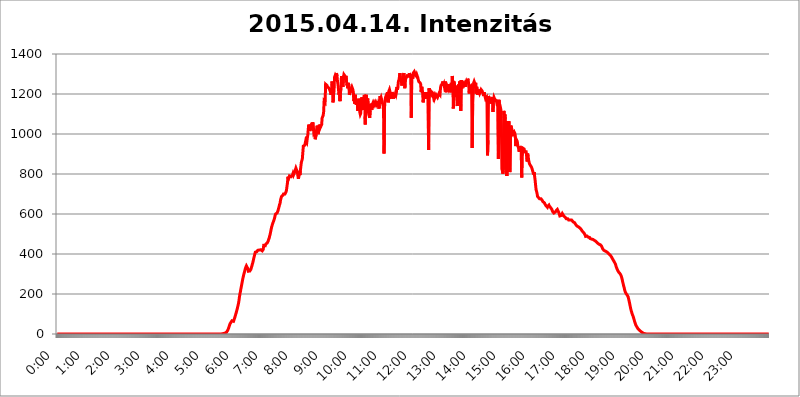
| Category | 2015.04.14. Intenzitás [W/m^2] |
|---|---|
| 0.0 | -0.256 |
| 0.0006944444444444445 | -0.256 |
| 0.001388888888888889 | -0.256 |
| 0.0020833333333333333 | -0.256 |
| 0.002777777777777778 | -0.256 |
| 0.003472222222222222 | -0.256 |
| 0.004166666666666667 | -0.256 |
| 0.004861111111111111 | -0.256 |
| 0.005555555555555556 | -0.256 |
| 0.0062499999999999995 | -0.256 |
| 0.006944444444444444 | -0.256 |
| 0.007638888888888889 | -0.256 |
| 0.008333333333333333 | -0.256 |
| 0.009027777777777779 | -0.256 |
| 0.009722222222222222 | -0.256 |
| 0.010416666666666666 | -0.256 |
| 0.011111111111111112 | -0.256 |
| 0.011805555555555555 | -0.256 |
| 0.012499999999999999 | -0.256 |
| 0.013194444444444444 | -0.256 |
| 0.013888888888888888 | -0.256 |
| 0.014583333333333332 | -0.256 |
| 0.015277777777777777 | -0.256 |
| 0.015972222222222224 | -0.256 |
| 0.016666666666666666 | -0.256 |
| 0.017361111111111112 | -0.256 |
| 0.018055555555555557 | -0.256 |
| 0.01875 | -0.256 |
| 0.019444444444444445 | -0.256 |
| 0.02013888888888889 | -0.256 |
| 0.020833333333333332 | -0.256 |
| 0.02152777777777778 | -0.256 |
| 0.022222222222222223 | -0.256 |
| 0.02291666666666667 | -0.256 |
| 0.02361111111111111 | -0.256 |
| 0.024305555555555556 | -0.256 |
| 0.024999999999999998 | -0.256 |
| 0.025694444444444447 | -0.256 |
| 0.02638888888888889 | -0.256 |
| 0.027083333333333334 | -0.256 |
| 0.027777777777777776 | -0.256 |
| 0.02847222222222222 | -0.256 |
| 0.029166666666666664 | -0.256 |
| 0.029861111111111113 | -0.256 |
| 0.030555555555555555 | -0.256 |
| 0.03125 | -0.256 |
| 0.03194444444444445 | -0.256 |
| 0.03263888888888889 | -0.256 |
| 0.03333333333333333 | -0.256 |
| 0.034027777777777775 | -0.256 |
| 0.034722222222222224 | -0.256 |
| 0.035416666666666666 | -0.256 |
| 0.036111111111111115 | -0.256 |
| 0.03680555555555556 | -0.256 |
| 0.0375 | -0.256 |
| 0.03819444444444444 | -0.256 |
| 0.03888888888888889 | -0.256 |
| 0.03958333333333333 | -0.256 |
| 0.04027777777777778 | -0.256 |
| 0.04097222222222222 | -0.256 |
| 0.041666666666666664 | -0.256 |
| 0.042361111111111106 | -0.256 |
| 0.04305555555555556 | -0.256 |
| 0.043750000000000004 | -0.256 |
| 0.044444444444444446 | -0.256 |
| 0.04513888888888889 | -0.256 |
| 0.04583333333333334 | -0.256 |
| 0.04652777777777778 | -0.256 |
| 0.04722222222222222 | -0.256 |
| 0.04791666666666666 | -0.256 |
| 0.04861111111111111 | -0.256 |
| 0.049305555555555554 | -0.256 |
| 0.049999999999999996 | -0.256 |
| 0.05069444444444445 | -0.256 |
| 0.051388888888888894 | -0.256 |
| 0.052083333333333336 | -0.256 |
| 0.05277777777777778 | -0.256 |
| 0.05347222222222222 | -0.256 |
| 0.05416666666666667 | -0.256 |
| 0.05486111111111111 | -0.256 |
| 0.05555555555555555 | -0.256 |
| 0.05625 | -0.256 |
| 0.05694444444444444 | -0.256 |
| 0.057638888888888885 | -0.256 |
| 0.05833333333333333 | -0.256 |
| 0.05902777777777778 | -0.256 |
| 0.059722222222222225 | -0.256 |
| 0.06041666666666667 | -0.256 |
| 0.061111111111111116 | -0.256 |
| 0.06180555555555556 | -0.256 |
| 0.0625 | -0.256 |
| 0.06319444444444444 | -0.256 |
| 0.06388888888888888 | -0.256 |
| 0.06458333333333334 | -0.256 |
| 0.06527777777777778 | -0.256 |
| 0.06597222222222222 | -0.256 |
| 0.06666666666666667 | -0.256 |
| 0.06736111111111111 | -0.256 |
| 0.06805555555555555 | -0.256 |
| 0.06874999999999999 | -0.256 |
| 0.06944444444444443 | -0.256 |
| 0.07013888888888889 | -0.256 |
| 0.07083333333333333 | -0.256 |
| 0.07152777777777779 | -0.256 |
| 0.07222222222222223 | -0.256 |
| 0.07291666666666667 | -0.256 |
| 0.07361111111111111 | -0.256 |
| 0.07430555555555556 | -0.256 |
| 0.075 | -0.256 |
| 0.07569444444444444 | -0.256 |
| 0.0763888888888889 | -0.256 |
| 0.07708333333333334 | -0.256 |
| 0.07777777777777778 | -0.256 |
| 0.07847222222222222 | -0.256 |
| 0.07916666666666666 | -0.256 |
| 0.0798611111111111 | -0.256 |
| 0.08055555555555556 | -0.256 |
| 0.08125 | -0.256 |
| 0.08194444444444444 | -0.256 |
| 0.08263888888888889 | -0.256 |
| 0.08333333333333333 | -0.256 |
| 0.08402777777777777 | -0.256 |
| 0.08472222222222221 | -0.256 |
| 0.08541666666666665 | -0.256 |
| 0.08611111111111112 | -0.256 |
| 0.08680555555555557 | -0.256 |
| 0.08750000000000001 | -0.256 |
| 0.08819444444444445 | -0.256 |
| 0.08888888888888889 | -0.256 |
| 0.08958333333333333 | -0.256 |
| 0.09027777777777778 | -0.256 |
| 0.09097222222222222 | -0.256 |
| 0.09166666666666667 | -0.256 |
| 0.09236111111111112 | -0.256 |
| 0.09305555555555556 | -0.256 |
| 0.09375 | -0.256 |
| 0.09444444444444444 | -0.256 |
| 0.09513888888888888 | -0.256 |
| 0.09583333333333333 | -0.256 |
| 0.09652777777777777 | -0.256 |
| 0.09722222222222222 | -0.256 |
| 0.09791666666666667 | -0.256 |
| 0.09861111111111111 | -0.256 |
| 0.09930555555555555 | -0.256 |
| 0.09999999999999999 | -0.256 |
| 0.10069444444444443 | -0.256 |
| 0.1013888888888889 | -0.256 |
| 0.10208333333333335 | -0.256 |
| 0.10277777777777779 | -0.256 |
| 0.10347222222222223 | -0.256 |
| 0.10416666666666667 | -0.256 |
| 0.10486111111111111 | -0.256 |
| 0.10555555555555556 | -0.256 |
| 0.10625 | -0.256 |
| 0.10694444444444444 | -0.256 |
| 0.1076388888888889 | -0.256 |
| 0.10833333333333334 | -0.256 |
| 0.10902777777777778 | -0.256 |
| 0.10972222222222222 | -0.256 |
| 0.1111111111111111 | -0.256 |
| 0.11180555555555556 | -0.256 |
| 0.11180555555555556 | -0.256 |
| 0.1125 | -0.256 |
| 0.11319444444444444 | -0.256 |
| 0.11388888888888889 | -0.256 |
| 0.11458333333333333 | -0.256 |
| 0.11527777777777777 | -0.256 |
| 0.11597222222222221 | -0.256 |
| 0.11666666666666665 | -0.256 |
| 0.1173611111111111 | -0.256 |
| 0.11805555555555557 | -0.256 |
| 0.11944444444444445 | -0.256 |
| 0.12013888888888889 | -0.256 |
| 0.12083333333333333 | -0.256 |
| 0.12152777777777778 | -0.256 |
| 0.12222222222222223 | -0.256 |
| 0.12291666666666667 | -0.256 |
| 0.12291666666666667 | -0.256 |
| 0.12361111111111112 | -0.256 |
| 0.12430555555555556 | -0.256 |
| 0.125 | -0.256 |
| 0.12569444444444444 | -0.256 |
| 0.12638888888888888 | -0.256 |
| 0.12708333333333333 | -0.256 |
| 0.16875 | -0.256 |
| 0.12847222222222224 | -0.256 |
| 0.12916666666666668 | -0.256 |
| 0.12986111111111112 | -0.256 |
| 0.13055555555555556 | -0.256 |
| 0.13125 | -0.256 |
| 0.13194444444444445 | -0.256 |
| 0.1326388888888889 | -0.256 |
| 0.13333333333333333 | -0.256 |
| 0.13402777777777777 | -0.256 |
| 0.13402777777777777 | -0.256 |
| 0.13472222222222222 | -0.256 |
| 0.13541666666666666 | -0.256 |
| 0.1361111111111111 | -0.256 |
| 0.13749999999999998 | -0.256 |
| 0.13819444444444443 | -0.256 |
| 0.1388888888888889 | -0.256 |
| 0.13958333333333334 | -0.256 |
| 0.14027777777777778 | -0.256 |
| 0.14097222222222222 | -0.256 |
| 0.14166666666666666 | -0.256 |
| 0.1423611111111111 | -0.256 |
| 0.14305555555555557 | -0.256 |
| 0.14375000000000002 | -0.256 |
| 0.14444444444444446 | -0.256 |
| 0.1451388888888889 | -0.256 |
| 0.1451388888888889 | -0.256 |
| 0.14652777777777778 | -0.256 |
| 0.14722222222222223 | -0.256 |
| 0.14791666666666667 | -0.256 |
| 0.1486111111111111 | -0.256 |
| 0.14930555555555555 | -0.256 |
| 0.15 | -0.256 |
| 0.15069444444444444 | -0.256 |
| 0.15138888888888888 | -0.256 |
| 0.15208333333333332 | -0.256 |
| 0.15277777777777776 | -0.256 |
| 0.15347222222222223 | -0.256 |
| 0.15416666666666667 | -0.256 |
| 0.15486111111111112 | -0.256 |
| 0.15555555555555556 | -0.256 |
| 0.15625 | -0.256 |
| 0.15694444444444444 | -0.256 |
| 0.15763888888888888 | -0.256 |
| 0.15833333333333333 | -0.256 |
| 0.15902777777777777 | -0.256 |
| 0.15972222222222224 | -0.256 |
| 0.16041666666666668 | -0.256 |
| 0.16111111111111112 | -0.256 |
| 0.16180555555555556 | -0.256 |
| 0.1625 | -0.256 |
| 0.16319444444444445 | -0.256 |
| 0.1638888888888889 | -0.256 |
| 0.16458333333333333 | -0.256 |
| 0.16527777777777777 | -0.256 |
| 0.16597222222222222 | -0.256 |
| 0.16666666666666666 | -0.256 |
| 0.1673611111111111 | -0.256 |
| 0.16805555555555554 | -0.256 |
| 0.16874999999999998 | -0.256 |
| 0.16944444444444443 | -0.256 |
| 0.17013888888888887 | -0.256 |
| 0.1708333333333333 | -0.256 |
| 0.17152777777777775 | -0.256 |
| 0.17222222222222225 | -0.256 |
| 0.1729166666666667 | -0.256 |
| 0.17361111111111113 | -0.256 |
| 0.17430555555555557 | -0.256 |
| 0.17500000000000002 | -0.256 |
| 0.17569444444444446 | -0.256 |
| 0.1763888888888889 | -0.256 |
| 0.17708333333333334 | -0.256 |
| 0.17777777777777778 | -0.256 |
| 0.17847222222222223 | -0.256 |
| 0.17916666666666667 | -0.256 |
| 0.1798611111111111 | -0.256 |
| 0.18055555555555555 | -0.256 |
| 0.18125 | -0.256 |
| 0.18194444444444444 | -0.256 |
| 0.1826388888888889 | -0.256 |
| 0.18333333333333335 | -0.256 |
| 0.1840277777777778 | -0.256 |
| 0.18472222222222223 | -0.256 |
| 0.18541666666666667 | -0.256 |
| 0.18611111111111112 | -0.256 |
| 0.18680555555555556 | -0.256 |
| 0.1875 | -0.256 |
| 0.18819444444444444 | -0.256 |
| 0.18888888888888888 | -0.256 |
| 0.18958333333333333 | -0.256 |
| 0.19027777777777777 | -0.256 |
| 0.1909722222222222 | -0.256 |
| 0.19166666666666665 | -0.256 |
| 0.19236111111111112 | -0.256 |
| 0.19305555555555554 | -0.256 |
| 0.19375 | -0.256 |
| 0.19444444444444445 | -0.256 |
| 0.1951388888888889 | -0.256 |
| 0.19583333333333333 | -0.256 |
| 0.19652777777777777 | -0.256 |
| 0.19722222222222222 | -0.256 |
| 0.19791666666666666 | -0.256 |
| 0.1986111111111111 | -0.256 |
| 0.19930555555555554 | -0.256 |
| 0.19999999999999998 | -0.256 |
| 0.20069444444444443 | -0.256 |
| 0.20138888888888887 | -0.256 |
| 0.2020833333333333 | -0.256 |
| 0.2027777777777778 | -0.256 |
| 0.2034722222222222 | -0.256 |
| 0.2041666666666667 | -0.256 |
| 0.20486111111111113 | -0.256 |
| 0.20555555555555557 | -0.256 |
| 0.20625000000000002 | -0.256 |
| 0.20694444444444446 | -0.256 |
| 0.2076388888888889 | -0.256 |
| 0.20833333333333334 | -0.256 |
| 0.20902777777777778 | -0.256 |
| 0.20972222222222223 | -0.256 |
| 0.21041666666666667 | -0.256 |
| 0.2111111111111111 | -0.256 |
| 0.21180555555555555 | -0.256 |
| 0.2125 | -0.256 |
| 0.21319444444444444 | -0.256 |
| 0.2138888888888889 | -0.256 |
| 0.21458333333333335 | -0.256 |
| 0.2152777777777778 | -0.256 |
| 0.21597222222222223 | -0.256 |
| 0.21666666666666667 | -0.256 |
| 0.21736111111111112 | -0.256 |
| 0.21805555555555556 | -0.256 |
| 0.21875 | -0.256 |
| 0.21944444444444444 | -0.256 |
| 0.22013888888888888 | -0.256 |
| 0.22083333333333333 | -0.256 |
| 0.22152777777777777 | -0.256 |
| 0.2222222222222222 | -0.256 |
| 0.22291666666666665 | -0.256 |
| 0.2236111111111111 | -0.256 |
| 0.22430555555555556 | -0.256 |
| 0.225 | -0.256 |
| 0.22569444444444445 | -0.256 |
| 0.2263888888888889 | -0.256 |
| 0.22708333333333333 | -0.256 |
| 0.22777777777777777 | -0.256 |
| 0.22847222222222222 | -0.256 |
| 0.22916666666666666 | -0.256 |
| 0.2298611111111111 | -0.256 |
| 0.23055555555555554 | 1.09 |
| 0.23124999999999998 | 1.09 |
| 0.23194444444444443 | 1.09 |
| 0.23263888888888887 | 1.09 |
| 0.2333333333333333 | 2.439 |
| 0.2340277777777778 | 3.791 |
| 0.2347222222222222 | 3.791 |
| 0.2354166666666667 | 5.146 |
| 0.23611111111111113 | 6.503 |
| 0.23680555555555557 | 7.862 |
| 0.23750000000000002 | 9.225 |
| 0.23819444444444446 | 13.325 |
| 0.2388888888888889 | 17.444 |
| 0.23958333333333334 | 22.965 |
| 0.24027777777777778 | 28.514 |
| 0.24097222222222223 | 36.881 |
| 0.24166666666666667 | 43.886 |
| 0.2423611111111111 | 50.914 |
| 0.24305555555555555 | 55.139 |
| 0.24375 | 59.368 |
| 0.24444444444444446 | 63.6 |
| 0.24513888888888888 | 66.423 |
| 0.24583333333333335 | 65.012 |
| 0.2465277777777778 | 62.189 |
| 0.24722222222222223 | 63.6 |
| 0.24791666666666667 | 70.658 |
| 0.24861111111111112 | 77.715 |
| 0.24930555555555556 | 86.175 |
| 0.25 | 94.617 |
| 0.25069444444444444 | 103.035 |
| 0.2513888888888889 | 111.42 |
| 0.2520833333333333 | 121.152 |
| 0.25277777777777777 | 130.821 |
| 0.2534722222222222 | 141.782 |
| 0.25416666666666665 | 152.637 |
| 0.2548611111111111 | 167.374 |
| 0.2555555555555556 | 185.79 |
| 0.25625000000000003 | 201.258 |
| 0.2569444444444445 | 212.664 |
| 0.2576388888888889 | 227.618 |
| 0.25833333333333336 | 239.868 |
| 0.2590277777777778 | 253.137 |
| 0.25972222222222224 | 266.216 |
| 0.2604166666666667 | 279.136 |
| 0.2611111111111111 | 289.616 |
| 0.26180555555555557 | 300.041 |
| 0.2625 | 309.284 |
| 0.26319444444444445 | 318.527 |
| 0.2638888888888889 | 327.793 |
| 0.26458333333333334 | 334.774 |
| 0.2652777777777778 | 340.62 |
| 0.2659722222222222 | 342.968 |
| 0.26666666666666666 | 339.449 |
| 0.2673611111111111 | 326.633 |
| 0.26805555555555555 | 313.904 |
| 0.26875 | 310.439 |
| 0.26944444444444443 | 312.749 |
| 0.2701388888888889 | 315.059 |
| 0.2708333333333333 | 318.527 |
| 0.27152777777777776 | 323.156 |
| 0.2722222222222222 | 331.279 |
| 0.27291666666666664 | 339.449 |
| 0.2736111111111111 | 348.865 |
| 0.2743055555555555 | 357.196 |
| 0.27499999999999997 | 368.07 |
| 0.27569444444444446 | 379.171 |
| 0.27638888888888885 | 389.27 |
| 0.27708333333333335 | 399.628 |
| 0.2777777777777778 | 408.934 |
| 0.27847222222222223 | 407.589 |
| 0.2791666666666667 | 407.589 |
| 0.2798611111111111 | 411.638 |
| 0.28055555555555556 | 414.364 |
| 0.28125 | 418.495 |
| 0.28194444444444444 | 418.495 |
| 0.2826388888888889 | 418.495 |
| 0.2833333333333333 | 419.883 |
| 0.28402777777777777 | 422.678 |
| 0.2847222222222222 | 422.678 |
| 0.28541666666666665 | 421.278 |
| 0.28611111111111115 | 419.883 |
| 0.28680555555555554 | 417.112 |
| 0.28750000000000003 | 415.735 |
| 0.2881944444444445 | 417.112 |
| 0.2888888888888889 | 422.678 |
| 0.28958333333333336 | 442.962 |
| 0.2902777777777778 | 445.971 |
| 0.29097222222222224 | 447.487 |
| 0.2916666666666667 | 441.469 |
| 0.2923611111111111 | 449.011 |
| 0.29305555555555557 | 449.011 |
| 0.29375 | 452.082 |
| 0.29444444444444445 | 455.184 |
| 0.2951388888888889 | 459.898 |
| 0.29583333333333334 | 464.688 |
| 0.2965277777777778 | 472.848 |
| 0.2972222222222222 | 479.541 |
| 0.29791666666666666 | 489.873 |
| 0.2986111111111111 | 498.764 |
| 0.29930555555555555 | 511.671 |
| 0.3 | 523.186 |
| 0.30069444444444443 | 535.145 |
| 0.3013888888888889 | 543.376 |
| 0.3020833333333333 | 551.823 |
| 0.30277777777777776 | 558.305 |
| 0.3034722222222222 | 564.917 |
| 0.30416666666666664 | 571.661 |
| 0.3048611111111111 | 580.866 |
| 0.3055555555555555 | 592.725 |
| 0.30624999999999997 | 600.035 |
| 0.3069444444444444 | 600.035 |
| 0.3076388888888889 | 600.035 |
| 0.30833333333333335 | 604.992 |
| 0.3090277777777778 | 607.495 |
| 0.30972222222222223 | 617.682 |
| 0.3104166666666667 | 628.152 |
| 0.3111111111111111 | 636.194 |
| 0.31180555555555556 | 647.179 |
| 0.3125 | 652.786 |
| 0.31319444444444444 | 670.078 |
| 0.3138888888888889 | 673.03 |
| 0.3145833333333333 | 688.102 |
| 0.31527777777777777 | 691.18 |
| 0.3159722222222222 | 691.18 |
| 0.31666666666666665 | 694.278 |
| 0.31736111111111115 | 700.54 |
| 0.31805555555555554 | 700.54 |
| 0.31875000000000003 | 700.54 |
| 0.3194444444444445 | 700.54 |
| 0.3201388888888889 | 700.54 |
| 0.32083333333333336 | 710.098 |
| 0.3215277777777778 | 719.855 |
| 0.32222222222222224 | 723.153 |
| 0.3229166666666667 | 757.414 |
| 0.3236111111111111 | 786.575 |
| 0.32430555555555557 | 775.451 |
| 0.325 | 782.842 |
| 0.32569444444444445 | 790.334 |
| 0.3263888888888889 | 790.334 |
| 0.32708333333333334 | 786.575 |
| 0.3277777777777778 | 786.575 |
| 0.3284722222222222 | 786.575 |
| 0.32916666666666666 | 782.842 |
| 0.3298611111111111 | 794.119 |
| 0.33055555555555555 | 801.768 |
| 0.33125 | 794.119 |
| 0.33194444444444443 | 794.119 |
| 0.3326388888888889 | 805.632 |
| 0.3333333333333333 | 813.439 |
| 0.3340277777777778 | 817.382 |
| 0.3347222222222222 | 829.377 |
| 0.3354166666666667 | 825.351 |
| 0.3361111111111111 | 825.351 |
| 0.3368055555555556 | 809.522 |
| 0.33749999999999997 | 790.334 |
| 0.33819444444444446 | 775.451 |
| 0.33888888888888885 | 790.334 |
| 0.33958333333333335 | 813.439 |
| 0.34027777777777773 | 794.119 |
| 0.34097222222222223 | 817.382 |
| 0.3416666666666666 | 821.353 |
| 0.3423611111111111 | 858.335 |
| 0.3430555555555555 | 866.865 |
| 0.34375 | 875.511 |
| 0.3444444444444445 | 875.511 |
| 0.3451388888888889 | 939.404 |
| 0.3458333333333334 | 934.639 |
| 0.34652777777777777 | 939.404 |
| 0.34722222222222227 | 944.201 |
| 0.34791666666666665 | 944.201 |
| 0.34861111111111115 | 968.671 |
| 0.34930555555555554 | 973.663 |
| 0.35000000000000003 | 958.785 |
| 0.3506944444444444 | 978.688 |
| 0.3513888888888889 | 993.965 |
| 0.3520833333333333 | 1025.437 |
| 0.3527777777777778 | 1047.117 |
| 0.3534722222222222 | 1036.206 |
| 0.3541666666666667 | 1014.809 |
| 0.3548611111111111 | 1025.437 |
| 0.35555555555555557 | 1036.206 |
| 0.35625 | 1030.804 |
| 0.35694444444444445 | 1036.206 |
| 0.3576388888888889 | 1030.804 |
| 0.35833333333333334 | 1058.17 |
| 0.3590277777777778 | 1036.206 |
| 0.3597222222222222 | 1009.546 |
| 0.36041666666666666 | 1014.809 |
| 0.3611111111111111 | 1004.318 |
| 0.36180555555555555 | 973.663 |
| 0.3625 | 968.671 |
| 0.36319444444444443 | 999.125 |
| 0.3638888888888889 | 1025.437 |
| 0.3645833333333333 | 1041.644 |
| 0.3652777777777778 | 1014.809 |
| 0.3659722222222222 | 999.125 |
| 0.3666666666666667 | 1014.809 |
| 0.3673611111111111 | 1047.117 |
| 0.3680555555555556 | 1047.117 |
| 0.36874999999999997 | 1030.804 |
| 0.36944444444444446 | 1036.206 |
| 0.37013888888888885 | 1041.644 |
| 0.37083333333333335 | 1047.117 |
| 0.37152777777777773 | 1080.711 |
| 0.37222222222222223 | 1086.439 |
| 0.3729166666666666 | 1092.203 |
| 0.3736111111111111 | 1109.72 |
| 0.3743055555555555 | 1164.337 |
| 0.375 | 1164.337 |
| 0.3756944444444445 | 1158.113 |
| 0.3763888888888889 | 1248.934 |
| 0.3770833333333334 | 1248.934 |
| 0.37777777777777777 | 1248.934 |
| 0.37847222222222227 | 1242.179 |
| 0.37916666666666665 | 1235.465 |
| 0.37986111111111115 | 1235.465 |
| 0.38055555555555554 | 1235.465 |
| 0.38125000000000003 | 1228.794 |
| 0.3819444444444444 | 1222.164 |
| 0.3826388888888889 | 1222.164 |
| 0.3833333333333333 | 1209.029 |
| 0.3840277777777778 | 1196.058 |
| 0.3847222222222222 | 1222.164 |
| 0.3854166666666667 | 1262.571 |
| 0.3861111111111111 | 1235.465 |
| 0.38680555555555557 | 1158.113 |
| 0.3875 | 1196.058 |
| 0.38819444444444445 | 1215.576 |
| 0.3888888888888889 | 1283.348 |
| 0.38958333333333334 | 1290.36 |
| 0.3902777777777778 | 1283.348 |
| 0.3909722222222222 | 1297.416 |
| 0.39166666666666666 | 1304.515 |
| 0.3923611111111111 | 1290.36 |
| 0.39305555555555555 | 1262.571 |
| 0.39375 | 1248.934 |
| 0.39444444444444443 | 1248.934 |
| 0.3951388888888889 | 1196.058 |
| 0.3958333333333333 | 1209.029 |
| 0.3965277777777778 | 1164.337 |
| 0.3972222222222222 | 1209.029 |
| 0.3979166666666667 | 1222.164 |
| 0.3986111111111111 | 1290.36 |
| 0.3993055555555556 | 1262.571 |
| 0.39999999999999997 | 1248.934 |
| 0.40069444444444446 | 1235.465 |
| 0.40138888888888885 | 1283.348 |
| 0.40208333333333335 | 1297.416 |
| 0.40277777777777773 | 1297.416 |
| 0.40347222222222223 | 1290.36 |
| 0.4041666666666666 | 1269.454 |
| 0.4048611111111111 | 1290.36 |
| 0.4055555555555555 | 1269.454 |
| 0.40625 | 1242.179 |
| 0.4069444444444445 | 1248.934 |
| 0.4076388888888889 | 1228.794 |
| 0.4083333333333334 | 1255.731 |
| 0.40902777777777777 | 1242.179 |
| 0.40972222222222227 | 1196.058 |
| 0.41041666666666665 | 1202.523 |
| 0.41111111111111115 | 1202.523 |
| 0.41180555555555554 | 1202.523 |
| 0.41250000000000003 | 1228.794 |
| 0.4131944444444444 | 1235.465 |
| 0.4138888888888889 | 1235.465 |
| 0.4145833333333333 | 1222.164 |
| 0.4152777777777778 | 1209.029 |
| 0.4159722222222222 | 1164.337 |
| 0.4166666666666667 | 1183.249 |
| 0.4173611111111111 | 1151.928 |
| 0.41805555555555557 | 1196.058 |
| 0.41875 | 1164.337 |
| 0.41944444444444445 | 1145.782 |
| 0.4201388888888889 | 1164.337 |
| 0.42083333333333334 | 1151.928 |
| 0.4215277777777778 | 1115.634 |
| 0.4222222222222222 | 1151.928 |
| 0.42291666666666666 | 1176.905 |
| 0.4236111111111111 | 1127.578 |
| 0.42430555555555555 | 1109.72 |
| 0.425 | 1098.004 |
| 0.42569444444444443 | 1103.843 |
| 0.4263888888888889 | 1151.928 |
| 0.4270833333333333 | 1183.249 |
| 0.4277777777777778 | 1164.337 |
| 0.4284722222222222 | 1176.905 |
| 0.4291666666666667 | 1121.587 |
| 0.4298611111111111 | 1170.601 |
| 0.4305555555555556 | 1196.058 |
| 0.43124999999999997 | 1189.633 |
| 0.43194444444444446 | 1047.117 |
| 0.43263888888888885 | 1176.905 |
| 0.43333333333333335 | 1196.058 |
| 0.43402777777777773 | 1176.905 |
| 0.43472222222222223 | 1158.113 |
| 0.4354166666666666 | 1176.905 |
| 0.4361111111111111 | 1139.675 |
| 0.4368055555555555 | 1098.004 |
| 0.4375 | 1092.203 |
| 0.4381944444444445 | 1080.711 |
| 0.4388888888888889 | 1115.634 |
| 0.4395833333333334 | 1151.928 |
| 0.44027777777777777 | 1145.782 |
| 0.44097222222222227 | 1121.587 |
| 0.44166666666666665 | 1127.578 |
| 0.44236111111111115 | 1151.928 |
| 0.44305555555555554 | 1158.113 |
| 0.44375000000000003 | 1158.113 |
| 0.4444444444444444 | 1145.782 |
| 0.4451388888888889 | 1151.928 |
| 0.4458333333333333 | 1139.675 |
| 0.4465277777777778 | 1151.928 |
| 0.4472222222222222 | 1145.782 |
| 0.4479166666666667 | 1151.928 |
| 0.4486111111111111 | 1139.675 |
| 0.44930555555555557 | 1164.337 |
| 0.45 | 1139.675 |
| 0.45069444444444445 | 1145.782 |
| 0.4513888888888889 | 1127.578 |
| 0.45208333333333334 | 1170.601 |
| 0.4527777777777778 | 1189.633 |
| 0.4534722222222222 | 1176.905 |
| 0.45416666666666666 | 1183.249 |
| 0.4548611111111111 | 1183.249 |
| 0.45555555555555555 | 1164.337 |
| 0.45625 | 1151.928 |
| 0.45694444444444443 | 1145.782 |
| 0.4576388888888889 | 1115.634 |
| 0.4583333333333333 | 902.16 |
| 0.4590277777777778 | 1133.607 |
| 0.4597222222222222 | 1164.337 |
| 0.4604166666666667 | 1183.249 |
| 0.4611111111111111 | 1189.633 |
| 0.4618055555555556 | 1183.249 |
| 0.46249999999999997 | 1196.058 |
| 0.46319444444444446 | 1209.029 |
| 0.46388888888888885 | 1183.249 |
| 0.46458333333333335 | 1158.113 |
| 0.46527777777777773 | 1215.576 |
| 0.46597222222222223 | 1222.164 |
| 0.4666666666666666 | 1222.164 |
| 0.4673611111111111 | 1202.523 |
| 0.4680555555555555 | 1183.249 |
| 0.46875 | 1176.905 |
| 0.4694444444444445 | 1209.029 |
| 0.4701388888888889 | 1202.523 |
| 0.4708333333333334 | 1196.058 |
| 0.47152777777777777 | 1176.905 |
| 0.47222222222222227 | 1196.058 |
| 0.47291666666666665 | 1183.249 |
| 0.47361111111111115 | 1183.249 |
| 0.47430555555555554 | 1202.523 |
| 0.47500000000000003 | 1196.058 |
| 0.4756944444444444 | 1209.029 |
| 0.4763888888888889 | 1235.465 |
| 0.4770833333333333 | 1222.164 |
| 0.4777777777777778 | 1235.465 |
| 0.4784722222222222 | 1262.571 |
| 0.4791666666666667 | 1269.454 |
| 0.4798611111111111 | 1283.348 |
| 0.48055555555555557 | 1304.515 |
| 0.48125 | 1276.38 |
| 0.48194444444444445 | 1276.38 |
| 0.4826388888888889 | 1269.454 |
| 0.48333333333333334 | 1242.179 |
| 0.4840277777777778 | 1276.38 |
| 0.4847222222222222 | 1262.571 |
| 0.48541666666666666 | 1297.416 |
| 0.4861111111111111 | 1304.515 |
| 0.48680555555555555 | 1283.348 |
| 0.4875 | 1228.794 |
| 0.48819444444444443 | 1283.348 |
| 0.4888888888888889 | 1276.38 |
| 0.4895833333333333 | 1283.348 |
| 0.4902777777777778 | 1283.348 |
| 0.4909722222222222 | 1290.36 |
| 0.4916666666666667 | 1297.416 |
| 0.4923611111111111 | 1283.348 |
| 0.4930555555555556 | 1290.36 |
| 0.49374999999999997 | 1304.515 |
| 0.49444444444444446 | 1297.416 |
| 0.49513888888888885 | 1297.416 |
| 0.49583333333333335 | 1290.36 |
| 0.49652777777777773 | 1080.711 |
| 0.49722222222222223 | 1297.416 |
| 0.4979166666666666 | 1290.36 |
| 0.4986111111111111 | 1276.38 |
| 0.4993055555555555 | 1304.515 |
| 0.5 | 1304.515 |
| 0.5006944444444444 | 1311.658 |
| 0.5013888888888889 | 1311.658 |
| 0.5020833333333333 | 1297.416 |
| 0.5027777777777778 | 1297.416 |
| 0.5034722222222222 | 1290.36 |
| 0.5041666666666667 | 1297.416 |
| 0.5048611111111111 | 1290.36 |
| 0.5055555555555555 | 1283.348 |
| 0.50625 | 1283.348 |
| 0.5069444444444444 | 1262.571 |
| 0.5076388888888889 | 1262.571 |
| 0.5083333333333333 | 1262.571 |
| 0.5090277777777777 | 1255.731 |
| 0.5097222222222222 | 1248.934 |
| 0.5104166666666666 | 1209.029 |
| 0.5111111111111112 | 1235.465 |
| 0.5118055555555555 | 1228.794 |
| 0.5125000000000001 | 1202.523 |
| 0.5131944444444444 | 1158.113 |
| 0.513888888888889 | 1183.249 |
| 0.5145833333333333 | 1176.905 |
| 0.5152777777777778 | 1196.058 |
| 0.5159722222222222 | 1209.029 |
| 0.5166666666666667 | 1209.029 |
| 0.517361111111111 | 1176.905 |
| 0.5180555555555556 | 1189.633 |
| 0.5187499999999999 | 1209.029 |
| 0.5194444444444445 | 1189.633 |
| 0.5201388888888888 | 1209.029 |
| 0.5208333333333334 | 920.533 |
| 0.5215277777777778 | 1228.794 |
| 0.5222222222222223 | 1215.576 |
| 0.5229166666666667 | 1222.164 |
| 0.5236111111111111 | 1189.633 |
| 0.5243055555555556 | 1215.576 |
| 0.525 | 1196.058 |
| 0.5256944444444445 | 1196.058 |
| 0.5263888888888889 | 1202.523 |
| 0.5270833333333333 | 1196.058 |
| 0.5277777777777778 | 1183.249 |
| 0.5284722222222222 | 1189.633 |
| 0.5291666666666667 | 1176.905 |
| 0.5298611111111111 | 1176.905 |
| 0.5305555555555556 | 1176.905 |
| 0.53125 | 1196.058 |
| 0.5319444444444444 | 1196.058 |
| 0.5326388888888889 | 1196.058 |
| 0.5333333333333333 | 1183.249 |
| 0.5340277777777778 | 1183.249 |
| 0.5347222222222222 | 1196.058 |
| 0.5354166666666667 | 1202.523 |
| 0.5361111111111111 | 1202.523 |
| 0.5368055555555555 | 1196.058 |
| 0.5375 | 1228.794 |
| 0.5381944444444444 | 1242.179 |
| 0.5388888888888889 | 1242.179 |
| 0.5395833333333333 | 1248.934 |
| 0.5402777777777777 | 1248.934 |
| 0.5409722222222222 | 1262.571 |
| 0.5416666666666666 | 1242.179 |
| 0.5423611111111112 | 1248.934 |
| 0.5430555555555555 | 1235.465 |
| 0.5437500000000001 | 1242.179 |
| 0.5444444444444444 | 1262.571 |
| 0.545138888888889 | 1209.029 |
| 0.5458333333333333 | 1242.179 |
| 0.5465277777777778 | 1222.164 |
| 0.5472222222222222 | 1235.465 |
| 0.5479166666666667 | 1228.794 |
| 0.548611111111111 | 1242.179 |
| 0.5493055555555556 | 1248.934 |
| 0.5499999999999999 | 1248.934 |
| 0.5506944444444445 | 1209.029 |
| 0.5513888888888888 | 1242.179 |
| 0.5520833333333334 | 1248.934 |
| 0.5527777777777778 | 1255.731 |
| 0.5534722222222223 | 1209.029 |
| 0.5541666666666667 | 1290.36 |
| 0.5548611111111111 | 1248.934 |
| 0.5555555555555556 | 1127.578 |
| 0.55625 | 1262.571 |
| 0.5569444444444445 | 1262.571 |
| 0.5576388888888889 | 1235.465 |
| 0.5583333333333333 | 1242.179 |
| 0.5590277777777778 | 1222.164 |
| 0.5597222222222222 | 1202.523 |
| 0.5604166666666667 | 1202.523 |
| 0.5611111111111111 | 1139.675 |
| 0.5618055555555556 | 1215.576 |
| 0.5625 | 1235.465 |
| 0.5631944444444444 | 1248.934 |
| 0.5638888888888889 | 1235.465 |
| 0.5645833333333333 | 1262.571 |
| 0.5652777777777778 | 1222.164 |
| 0.5659722222222222 | 1115.634 |
| 0.5666666666666667 | 1269.454 |
| 0.5673611111111111 | 1228.794 |
| 0.5680555555555555 | 1235.465 |
| 0.56875 | 1248.934 |
| 0.5694444444444444 | 1248.934 |
| 0.5701388888888889 | 1255.731 |
| 0.5708333333333333 | 1248.934 |
| 0.5715277777777777 | 1255.731 |
| 0.5722222222222222 | 1235.465 |
| 0.5729166666666666 | 1255.731 |
| 0.5736111111111112 | 1262.571 |
| 0.5743055555555555 | 1255.731 |
| 0.5750000000000001 | 1262.571 |
| 0.5756944444444444 | 1276.38 |
| 0.576388888888889 | 1269.454 |
| 0.5770833333333333 | 1248.934 |
| 0.5777777777777778 | 1202.523 |
| 0.5784722222222222 | 1235.465 |
| 0.5791666666666667 | 1235.465 |
| 0.579861111111111 | 1235.465 |
| 0.5805555555555556 | 1242.179 |
| 0.5812499999999999 | 1209.029 |
| 0.5819444444444445 | 929.905 |
| 0.5826388888888888 | 1151.928 |
| 0.5833333333333334 | 1202.523 |
| 0.5840277777777778 | 1255.731 |
| 0.5847222222222223 | 1262.571 |
| 0.5854166666666667 | 1262.571 |
| 0.5861111111111111 | 1248.934 |
| 0.5868055555555556 | 1255.731 |
| 0.5875 | 1202.523 |
| 0.5881944444444445 | 1235.465 |
| 0.5888888888888889 | 1228.794 |
| 0.5895833333333333 | 1196.058 |
| 0.5902777777777778 | 1222.164 |
| 0.5909722222222222 | 1215.576 |
| 0.5916666666666667 | 1209.029 |
| 0.5923611111111111 | 1202.523 |
| 0.5930555555555556 | 1202.523 |
| 0.59375 | 1215.576 |
| 0.5944444444444444 | 1222.164 |
| 0.5951388888888889 | 1222.164 |
| 0.5958333333333333 | 1215.576 |
| 0.5965277777777778 | 1209.029 |
| 0.5972222222222222 | 1202.523 |
| 0.5979166666666667 | 1189.633 |
| 0.5986111111111111 | 1209.029 |
| 0.5993055555555555 | 1196.058 |
| 0.6 | 1196.058 |
| 0.6006944444444444 | 1176.905 |
| 0.6013888888888889 | 1176.905 |
| 0.6020833333333333 | 1183.249 |
| 0.6027777777777777 | 1151.928 |
| 0.6034722222222222 | 893.157 |
| 0.6041666666666666 | 968.671 |
| 0.6048611111111112 | 1189.633 |
| 0.6055555555555555 | 1183.249 |
| 0.6062500000000001 | 1183.249 |
| 0.6069444444444444 | 1164.337 |
| 0.607638888888889 | 1164.337 |
| 0.6083333333333333 | 1170.601 |
| 0.6090277777777778 | 1151.928 |
| 0.6097222222222222 | 1183.249 |
| 0.6104166666666667 | 1170.601 |
| 0.611111111111111 | 1109.72 |
| 0.6118055555555556 | 1170.601 |
| 0.6124999999999999 | 1183.249 |
| 0.6131944444444445 | 1176.905 |
| 0.6138888888888888 | 1176.905 |
| 0.6145833333333334 | 1170.601 |
| 0.6152777777777778 | 1170.601 |
| 0.6159722222222223 | 1164.337 |
| 0.6166666666666667 | 1164.337 |
| 0.6173611111111111 | 1139.675 |
| 0.6180555555555556 | 1170.601 |
| 0.61875 | 875.511 |
| 0.6194444444444445 | 1170.601 |
| 0.6201388888888889 | 1151.928 |
| 0.6208333333333333 | 1145.782 |
| 0.6215277777777778 | 1145.782 |
| 0.6222222222222222 | 1121.587 |
| 0.6229166666666667 | 1041.644 |
| 0.6236111111111111 | 825.351 |
| 0.6243055555555556 | 817.382 |
| 0.625 | 801.768 |
| 0.6256944444444444 | 817.382 |
| 0.6263888888888889 | 1115.634 |
| 0.6270833333333333 | 1080.711 |
| 0.6277777777777778 | 1098.004 |
| 0.6284722222222222 | 1075.021 |
| 0.6291666666666667 | 821.353 |
| 0.6298611111111111 | 1063.751 |
| 0.6305555555555555 | 790.334 |
| 0.63125 | 1063.751 |
| 0.6319444444444444 | 1063.751 |
| 0.6326388888888889 | 866.865 |
| 0.6333333333333333 | 1063.751 |
| 0.6340277777777777 | 1063.751 |
| 0.6347222222222222 | 809.522 |
| 0.6354166666666666 | 813.439 |
| 0.6361111111111112 | 1041.644 |
| 0.6368055555555555 | 1041.644 |
| 0.6375000000000001 | 1025.437 |
| 0.6381944444444444 | 1025.437 |
| 0.638888888888889 | 988.839 |
| 0.6395833333333333 | 1020.106 |
| 0.6402777777777778 | 1014.809 |
| 0.6409722222222222 | 1014.809 |
| 0.6416666666666667 | 1004.318 |
| 0.642361111111111 | 993.965 |
| 0.6430555555555556 | 939.404 |
| 0.6437499999999999 | 973.663 |
| 0.6444444444444445 | 968.671 |
| 0.6451388888888888 | 963.712 |
| 0.6458333333333334 | 944.201 |
| 0.6465277777777778 | 939.404 |
| 0.6472222222222223 | 925.203 |
| 0.6479166666666667 | 911.285 |
| 0.6486111111111111 | 939.404 |
| 0.6493055555555556 | 939.404 |
| 0.65 | 944.201 |
| 0.6506944444444445 | 920.533 |
| 0.6513888888888889 | 782.842 |
| 0.6520833333333333 | 906.707 |
| 0.6527777777777778 | 929.905 |
| 0.6534722222222222 | 929.905 |
| 0.6541666666666667 | 925.203 |
| 0.6548611111111111 | 925.203 |
| 0.6555555555555556 | 911.285 |
| 0.65625 | 906.707 |
| 0.6569444444444444 | 911.285 |
| 0.6576388888888889 | 911.285 |
| 0.6583333333333333 | 915.893 |
| 0.6590277777777778 | 862.585 |
| 0.6597222222222222 | 902.16 |
| 0.6604166666666667 | 888.701 |
| 0.6611111111111111 | 871.173 |
| 0.6618055555555555 | 858.335 |
| 0.6625 | 849.92 |
| 0.6631944444444444 | 849.92 |
| 0.6638888888888889 | 841.619 |
| 0.6645833333333333 | 837.51 |
| 0.6652777777777777 | 833.43 |
| 0.6659722222222222 | 825.351 |
| 0.6666666666666666 | 817.382 |
| 0.6673611111111111 | 817.382 |
| 0.6680555555555556 | 797.931 |
| 0.6687500000000001 | 809.522 |
| 0.6694444444444444 | 790.334 |
| 0.6701388888888888 | 771.794 |
| 0.6708333333333334 | 746.886 |
| 0.6715277777777778 | 723.153 |
| 0.6722222222222222 | 713.328 |
| 0.6729166666666666 | 703.704 |
| 0.6736111111111112 | 688.102 |
| 0.6743055555555556 | 685.046 |
| 0.6749999999999999 | 682.011 |
| 0.6756944444444444 | 678.997 |
| 0.6763888888888889 | 676.003 |
| 0.6770833333333334 | 676.003 |
| 0.6777777777777777 | 678.997 |
| 0.6784722222222223 | 676.003 |
| 0.6791666666666667 | 673.03 |
| 0.6798611111111111 | 670.078 |
| 0.6805555555555555 | 667.146 |
| 0.68125 | 661.343 |
| 0.6819444444444445 | 658.471 |
| 0.6826388888888889 | 658.471 |
| 0.6833333333333332 | 655.618 |
| 0.6840277777777778 | 649.973 |
| 0.6847222222222222 | 647.179 |
| 0.6854166666666667 | 641.649 |
| 0.686111111111111 | 641.649 |
| 0.6868055555555556 | 644.405 |
| 0.6875 | 633.495 |
| 0.6881944444444444 | 638.912 |
| 0.688888888888889 | 641.649 |
| 0.6895833333333333 | 644.405 |
| 0.6902777777777778 | 638.912 |
| 0.6909722222222222 | 636.194 |
| 0.6916666666666668 | 633.495 |
| 0.6923611111111111 | 630.814 |
| 0.6930555555555555 | 633.495 |
| 0.69375 | 622.881 |
| 0.6944444444444445 | 615.11 |
| 0.6951388888888889 | 610.016 |
| 0.6958333333333333 | 607.495 |
| 0.6965277777777777 | 604.992 |
| 0.6972222222222223 | 604.992 |
| 0.6979166666666666 | 607.495 |
| 0.6986111111111111 | 610.016 |
| 0.6993055555555556 | 610.016 |
| 0.7000000000000001 | 617.682 |
| 0.7006944444444444 | 620.273 |
| 0.7013888888888888 | 622.881 |
| 0.7020833333333334 | 617.682 |
| 0.7027777777777778 | 615.11 |
| 0.7034722222222222 | 607.495 |
| 0.7041666666666666 | 602.505 |
| 0.7048611111111112 | 590.321 |
| 0.7055555555555556 | 587.934 |
| 0.7062499999999999 | 592.725 |
| 0.7069444444444444 | 592.725 |
| 0.7076388888888889 | 595.145 |
| 0.7083333333333334 | 602.505 |
| 0.7090277777777777 | 600.035 |
| 0.7097222222222223 | 597.582 |
| 0.7104166666666667 | 590.321 |
| 0.7111111111111111 | 587.934 |
| 0.7118055555555555 | 585.562 |
| 0.7125 | 583.206 |
| 0.7131944444444445 | 580.866 |
| 0.7138888888888889 | 576.233 |
| 0.7145833333333332 | 578.542 |
| 0.7152777777777778 | 576.233 |
| 0.7159722222222222 | 576.233 |
| 0.7166666666666667 | 571.661 |
| 0.717361111111111 | 569.398 |
| 0.7180555555555556 | 569.398 |
| 0.71875 | 569.398 |
| 0.7194444444444444 | 569.398 |
| 0.720138888888889 | 569.398 |
| 0.7208333333333333 | 567.15 |
| 0.7215277777777778 | 569.398 |
| 0.7222222222222222 | 564.917 |
| 0.7229166666666668 | 564.917 |
| 0.7236111111111111 | 560.495 |
| 0.7243055555555555 | 558.305 |
| 0.725 | 556.131 |
| 0.7256944444444445 | 556.131 |
| 0.7263888888888889 | 551.823 |
| 0.7270833333333333 | 547.572 |
| 0.7277777777777777 | 545.467 |
| 0.7284722222222223 | 543.376 |
| 0.7291666666666666 | 539.234 |
| 0.7298611111111111 | 539.234 |
| 0.7305555555555556 | 537.182 |
| 0.7312500000000001 | 535.145 |
| 0.7319444444444444 | 533.12 |
| 0.7326388888888888 | 531.108 |
| 0.7333333333333334 | 529.108 |
| 0.7340277777777778 | 527.122 |
| 0.7347222222222222 | 523.186 |
| 0.7354166666666666 | 519.3 |
| 0.7361111111111112 | 515.462 |
| 0.7368055555555556 | 513.561 |
| 0.7374999999999999 | 509.793 |
| 0.7381944444444444 | 507.927 |
| 0.7388888888888889 | 504.229 |
| 0.7395833333333334 | 500.575 |
| 0.7402777777777777 | 495.176 |
| 0.7409722222222223 | 488.126 |
| 0.7416666666666667 | 488.126 |
| 0.7423611111111111 | 489.873 |
| 0.7430555555555555 | 489.873 |
| 0.74375 | 489.873 |
| 0.7444444444444445 | 484.662 |
| 0.7451388888888889 | 484.662 |
| 0.7458333333333332 | 486.389 |
| 0.7465277777777778 | 482.945 |
| 0.7472222222222222 | 477.854 |
| 0.7479166666666667 | 474.507 |
| 0.748611111111111 | 476.176 |
| 0.7493055555555556 | 474.507 |
| 0.75 | 472.848 |
| 0.7506944444444444 | 471.198 |
| 0.751388888888889 | 472.848 |
| 0.7520833333333333 | 471.198 |
| 0.7527777777777778 | 469.557 |
| 0.7534722222222222 | 467.925 |
| 0.7541666666666668 | 467.925 |
| 0.7548611111111111 | 466.302 |
| 0.7555555555555555 | 463.083 |
| 0.75625 | 461.486 |
| 0.7569444444444445 | 458.318 |
| 0.7576388888888889 | 455.184 |
| 0.7583333333333333 | 452.082 |
| 0.7590277777777777 | 452.082 |
| 0.7597222222222223 | 449.011 |
| 0.7604166666666666 | 445.971 |
| 0.7611111111111111 | 444.463 |
| 0.7618055555555556 | 445.971 |
| 0.7625000000000001 | 442.962 |
| 0.7631944444444444 | 439.982 |
| 0.7638888888888888 | 437.031 |
| 0.7645833333333334 | 429.773 |
| 0.7652777777777778 | 424.085 |
| 0.7659722222222222 | 419.883 |
| 0.7666666666666666 | 418.495 |
| 0.7673611111111112 | 415.735 |
| 0.7680555555555556 | 414.364 |
| 0.7687499999999999 | 414.364 |
| 0.7694444444444444 | 412.998 |
| 0.7701388888888889 | 411.638 |
| 0.7708333333333334 | 410.283 |
| 0.7715277777777777 | 408.934 |
| 0.7722222222222223 | 406.25 |
| 0.7729166666666667 | 403.587 |
| 0.7736111111111111 | 400.943 |
| 0.7743055555555555 | 398.318 |
| 0.775 | 397.012 |
| 0.7756944444444445 | 394.415 |
| 0.7763888888888889 | 390.55 |
| 0.7770833333333332 | 386.723 |
| 0.7777777777777778 | 382.93 |
| 0.7784722222222222 | 377.925 |
| 0.7791666666666667 | 374.206 |
| 0.779861111111111 | 369.291 |
| 0.7805555555555556 | 364.422 |
| 0.78125 | 360.798 |
| 0.7819444444444444 | 355.999 |
| 0.782638888888889 | 351.235 |
| 0.7833333333333333 | 344.144 |
| 0.7840277777777778 | 334.774 |
| 0.7847222222222222 | 328.955 |
| 0.7854166666666668 | 323.156 |
| 0.7861111111111111 | 317.371 |
| 0.7868055555555555 | 312.749 |
| 0.7875 | 309.284 |
| 0.7881944444444445 | 306.974 |
| 0.7888888888888889 | 303.509 |
| 0.7895833333333333 | 300.041 |
| 0.7902777777777777 | 296.571 |
| 0.7909722222222223 | 289.616 |
| 0.7916666666666666 | 282.637 |
| 0.7923611111111111 | 272.106 |
| 0.7930555555555556 | 260.293 |
| 0.7937500000000001 | 250.739 |
| 0.7944444444444444 | 239.868 |
| 0.7951388888888888 | 231.313 |
| 0.7958333333333334 | 220.177 |
| 0.7965277777777778 | 211.405 |
| 0.7972222222222222 | 206.348 |
| 0.7979166666666666 | 201.258 |
| 0.7986111111111112 | 197.419 |
| 0.7993055555555556 | 194.849 |
| 0.7999999999999999 | 190.979 |
| 0.8006944444444444 | 185.79 |
| 0.8013888888888889 | 175.315 |
| 0.8020833333333334 | 164.712 |
| 0.8027777777777777 | 152.637 |
| 0.8034722222222223 | 140.417 |
| 0.8041666666666667 | 128.065 |
| 0.8048611111111111 | 118.378 |
| 0.8055555555555555 | 110.025 |
| 0.80625 | 101.634 |
| 0.8069444444444445 | 94.617 |
| 0.8076388888888889 | 88.991 |
| 0.8083333333333332 | 80.536 |
| 0.8090277777777778 | 72.069 |
| 0.8097222222222222 | 63.6 |
| 0.8104166666666667 | 55.139 |
| 0.811111111111111 | 48.1 |
| 0.8118055555555556 | 42.483 |
| 0.8125 | 38.28 |
| 0.8131944444444444 | 34.086 |
| 0.813888888888889 | 29.905 |
| 0.8145833333333333 | 25.736 |
| 0.8152777777777778 | 22.965 |
| 0.8159722222222222 | 21.582 |
| 0.8166666666666668 | 18.822 |
| 0.8173611111111111 | 16.069 |
| 0.8180555555555555 | 14.696 |
| 0.81875 | 11.956 |
| 0.8194444444444445 | 9.225 |
| 0.8201388888888889 | 7.862 |
| 0.8208333333333333 | 6.503 |
| 0.8215277777777777 | 5.146 |
| 0.8222222222222223 | 3.791 |
| 0.8229166666666666 | 2.439 |
| 0.8236111111111111 | 2.439 |
| 0.8243055555555556 | 1.09 |
| 0.8250000000000001 | 1.09 |
| 0.8256944444444444 | 1.09 |
| 0.8263888888888888 | -0.256 |
| 0.8270833333333334 | -0.256 |
| 0.8277777777777778 | -0.256 |
| 0.8284722222222222 | -0.256 |
| 0.8291666666666666 | -0.256 |
| 0.8298611111111112 | -0.256 |
| 0.8305555555555556 | -0.256 |
| 0.8312499999999999 | -0.256 |
| 0.8319444444444444 | -0.256 |
| 0.8326388888888889 | -0.256 |
| 0.8333333333333334 | -0.256 |
| 0.8340277777777777 | -0.256 |
| 0.8347222222222223 | -0.256 |
| 0.8354166666666667 | -0.256 |
| 0.8361111111111111 | -0.256 |
| 0.8368055555555555 | -0.256 |
| 0.8375 | -0.256 |
| 0.8381944444444445 | -0.256 |
| 0.8388888888888889 | -0.256 |
| 0.8395833333333332 | -0.256 |
| 0.8402777777777778 | -0.256 |
| 0.8409722222222222 | -0.256 |
| 0.8416666666666667 | -0.256 |
| 0.842361111111111 | -0.256 |
| 0.8430555555555556 | -0.256 |
| 0.84375 | -0.256 |
| 0.8444444444444444 | -0.256 |
| 0.845138888888889 | -0.256 |
| 0.8458333333333333 | -0.256 |
| 0.8465277777777778 | -0.256 |
| 0.8472222222222222 | -0.256 |
| 0.8479166666666668 | -0.256 |
| 0.8486111111111111 | -0.256 |
| 0.8493055555555555 | -0.256 |
| 0.85 | -0.256 |
| 0.8506944444444445 | -0.256 |
| 0.8513888888888889 | -0.256 |
| 0.8520833333333333 | -0.256 |
| 0.8527777777777777 | -0.256 |
| 0.8534722222222223 | -0.256 |
| 0.8541666666666666 | -0.256 |
| 0.8548611111111111 | -0.256 |
| 0.8555555555555556 | -0.256 |
| 0.8562500000000001 | -0.256 |
| 0.8569444444444444 | -0.256 |
| 0.8576388888888888 | -0.256 |
| 0.8583333333333334 | -0.256 |
| 0.8590277777777778 | -0.256 |
| 0.8597222222222222 | -0.256 |
| 0.8604166666666666 | -0.256 |
| 0.8611111111111112 | -0.256 |
| 0.8618055555555556 | -0.256 |
| 0.8624999999999999 | -0.256 |
| 0.8631944444444444 | -0.256 |
| 0.8638888888888889 | -0.256 |
| 0.8645833333333334 | -0.256 |
| 0.8652777777777777 | -0.256 |
| 0.8659722222222223 | -0.256 |
| 0.8666666666666667 | -0.256 |
| 0.8673611111111111 | -0.256 |
| 0.8680555555555555 | -0.256 |
| 0.86875 | -0.256 |
| 0.8694444444444445 | -0.256 |
| 0.8701388888888889 | -0.256 |
| 0.8708333333333332 | -0.256 |
| 0.8715277777777778 | -0.256 |
| 0.8722222222222222 | -0.256 |
| 0.8729166666666667 | -0.256 |
| 0.873611111111111 | -0.256 |
| 0.8743055555555556 | -0.256 |
| 0.875 | -0.256 |
| 0.8756944444444444 | -0.256 |
| 0.876388888888889 | -0.256 |
| 0.8770833333333333 | -0.256 |
| 0.8777777777777778 | -0.256 |
| 0.8784722222222222 | -0.256 |
| 0.8791666666666668 | -0.256 |
| 0.8798611111111111 | -0.256 |
| 0.8805555555555555 | -0.256 |
| 0.88125 | -0.256 |
| 0.8819444444444445 | -0.256 |
| 0.8826388888888889 | -0.256 |
| 0.8833333333333333 | -0.256 |
| 0.8840277777777777 | -0.256 |
| 0.8847222222222223 | -0.256 |
| 0.8854166666666666 | -0.256 |
| 0.8861111111111111 | -0.256 |
| 0.8868055555555556 | -0.256 |
| 0.8875000000000001 | -0.256 |
| 0.8881944444444444 | -0.256 |
| 0.8888888888888888 | -0.256 |
| 0.8895833333333334 | -0.256 |
| 0.8902777777777778 | -0.256 |
| 0.8909722222222222 | -0.256 |
| 0.8916666666666666 | -0.256 |
| 0.8923611111111112 | -0.256 |
| 0.8930555555555556 | -0.256 |
| 0.8937499999999999 | -0.256 |
| 0.8944444444444444 | -0.256 |
| 0.8951388888888889 | -0.256 |
| 0.8958333333333334 | -0.256 |
| 0.8965277777777777 | -0.256 |
| 0.8972222222222223 | -0.256 |
| 0.8979166666666667 | -0.256 |
| 0.8986111111111111 | -0.256 |
| 0.8993055555555555 | -0.256 |
| 0.9 | -0.256 |
| 0.9006944444444445 | -0.256 |
| 0.9013888888888889 | -0.256 |
| 0.9020833333333332 | -0.256 |
| 0.9027777777777778 | -0.256 |
| 0.9034722222222222 | -0.256 |
| 0.9041666666666667 | -0.256 |
| 0.904861111111111 | -0.256 |
| 0.9055555555555556 | -0.256 |
| 0.90625 | -0.256 |
| 0.9069444444444444 | -0.256 |
| 0.907638888888889 | -0.256 |
| 0.9083333333333333 | -0.256 |
| 0.9090277777777778 | -0.256 |
| 0.9097222222222222 | -0.256 |
| 0.9104166666666668 | -0.256 |
| 0.9111111111111111 | -0.256 |
| 0.9118055555555555 | -0.256 |
| 0.9125 | -0.256 |
| 0.9131944444444445 | -0.256 |
| 0.9138888888888889 | -0.256 |
| 0.9145833333333333 | -0.256 |
| 0.9152777777777777 | -0.256 |
| 0.9159722222222223 | -0.256 |
| 0.9166666666666666 | -0.256 |
| 0.9173611111111111 | -0.256 |
| 0.9180555555555556 | -0.256 |
| 0.9187500000000001 | -0.256 |
| 0.9194444444444444 | -0.256 |
| 0.9201388888888888 | -0.256 |
| 0.9208333333333334 | -0.256 |
| 0.9215277777777778 | -0.256 |
| 0.9222222222222222 | -0.256 |
| 0.9229166666666666 | -0.256 |
| 0.9236111111111112 | -0.256 |
| 0.9243055555555556 | -0.256 |
| 0.9249999999999999 | -0.256 |
| 0.9256944444444444 | -0.256 |
| 0.9263888888888889 | -0.256 |
| 0.9270833333333334 | -0.256 |
| 0.9277777777777777 | -0.256 |
| 0.9284722222222223 | -0.256 |
| 0.9291666666666667 | -0.256 |
| 0.9298611111111111 | -0.256 |
| 0.9305555555555555 | -0.256 |
| 0.93125 | -0.256 |
| 0.9319444444444445 | -0.256 |
| 0.9326388888888889 | -0.256 |
| 0.9333333333333332 | -0.256 |
| 0.9340277777777778 | -0.256 |
| 0.9347222222222222 | -0.256 |
| 0.9354166666666667 | -0.256 |
| 0.936111111111111 | -0.256 |
| 0.9368055555555556 | -0.256 |
| 0.9375 | -0.256 |
| 0.9381944444444444 | -0.256 |
| 0.938888888888889 | -0.256 |
| 0.9395833333333333 | -0.256 |
| 0.9402777777777778 | -0.256 |
| 0.9409722222222222 | -0.256 |
| 0.9416666666666668 | -0.256 |
| 0.9423611111111111 | -0.256 |
| 0.9430555555555555 | -0.256 |
| 0.94375 | -0.256 |
| 0.9444444444444445 | -0.256 |
| 0.9451388888888889 | -0.256 |
| 0.9458333333333333 | -0.256 |
| 0.9465277777777777 | -0.256 |
| 0.9472222222222223 | -0.256 |
| 0.9479166666666666 | -0.256 |
| 0.9486111111111111 | -0.256 |
| 0.9493055555555556 | -0.256 |
| 0.9500000000000001 | -0.256 |
| 0.9506944444444444 | -0.256 |
| 0.9513888888888888 | -0.256 |
| 0.9520833333333334 | -0.256 |
| 0.9527777777777778 | -0.256 |
| 0.9534722222222222 | -0.256 |
| 0.9541666666666666 | -0.256 |
| 0.9548611111111112 | -0.256 |
| 0.9555555555555556 | -0.256 |
| 0.9562499999999999 | -0.256 |
| 0.9569444444444444 | -0.256 |
| 0.9576388888888889 | -0.256 |
| 0.9583333333333334 | -0.256 |
| 0.9590277777777777 | -0.256 |
| 0.9597222222222223 | -0.256 |
| 0.9604166666666667 | -0.256 |
| 0.9611111111111111 | -0.256 |
| 0.9618055555555555 | -0.256 |
| 0.9625 | -0.256 |
| 0.9631944444444445 | -0.256 |
| 0.9638888888888889 | -0.256 |
| 0.9645833333333332 | -0.256 |
| 0.9652777777777778 | -0.256 |
| 0.9659722222222222 | -0.256 |
| 0.9666666666666667 | -0.256 |
| 0.967361111111111 | -0.256 |
| 0.9680555555555556 | -0.256 |
| 0.96875 | -0.256 |
| 0.9694444444444444 | -0.256 |
| 0.970138888888889 | -0.256 |
| 0.9708333333333333 | -0.256 |
| 0.9715277777777778 | -0.256 |
| 0.9722222222222222 | -0.256 |
| 0.9729166666666668 | -0.256 |
| 0.9736111111111111 | -0.256 |
| 0.9743055555555555 | -0.256 |
| 0.975 | -0.256 |
| 0.9756944444444445 | -0.256 |
| 0.9763888888888889 | -0.256 |
| 0.9770833333333333 | -0.256 |
| 0.9777777777777777 | -0.256 |
| 0.9784722222222223 | -0.256 |
| 0.9791666666666666 | -0.256 |
| 0.9798611111111111 | -0.256 |
| 0.9805555555555556 | -0.256 |
| 0.9812500000000001 | -0.256 |
| 0.9819444444444444 | -0.256 |
| 0.9826388888888888 | -0.256 |
| 0.9833333333333334 | -0.256 |
| 0.9840277777777778 | -0.256 |
| 0.9847222222222222 | -0.256 |
| 0.9854166666666666 | -0.256 |
| 0.9861111111111112 | -0.256 |
| 0.9868055555555556 | -0.256 |
| 0.9874999999999999 | -0.256 |
| 0.9881944444444444 | -0.256 |
| 0.9888888888888889 | -0.256 |
| 0.9895833333333334 | -0.256 |
| 0.9902777777777777 | -0.256 |
| 0.9909722222222223 | -0.256 |
| 0.9916666666666667 | -0.256 |
| 0.9923611111111111 | -0.256 |
| 0.9930555555555555 | -0.256 |
| 0.99375 | -0.256 |
| 0.9944444444444445 | -0.256 |
| 0.9951388888888889 | -0.256 |
| 0.9958333333333332 | -0.256 |
| 0.9965277777777778 | -0.256 |
| 0.9972222222222222 | -0.256 |
| 0.9979166666666667 | -0.256 |
| 0.998611111111111 | -0.256 |
| 0.9993055555555556 | 0 |